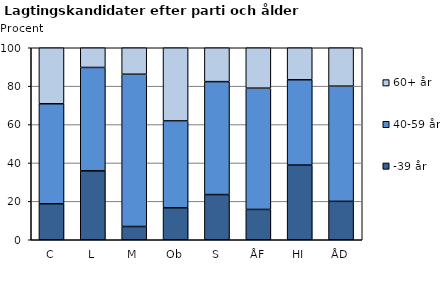
| Category | -39 år | 40-59 år | 60+ år |
|---|---|---|---|
| C | 18.75 | 52.083 | 29.167 |
| L | 35.897 | 53.846 | 10.256 |
| M | 6.897 | 79.31 | 13.793 |
| Ob | 16.667 | 45.238 | 38.095 |
| S | 23.529 | 58.824 | 17.647 |
| ÅF | 15.789 | 63.158 | 21.053 |
| HI | 38.889 | 44.444 | 16.667 |
| ÅD | 20 | 60 | 20 |